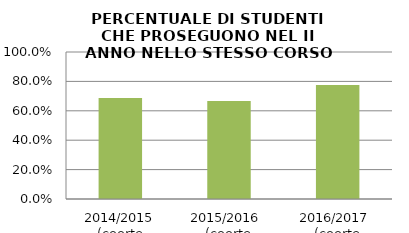
| Category | 2014/2015 (coorte 2013/14) 2015/2016  (coorte 2014/15) 2016/2017  (coorte 2015/16) |
|---|---|
| 2014/2015 (coorte 2013/14) | 0.688 |
| 2015/2016  (coorte 2014/15) | 0.667 |
| 2016/2017  (coorte 2015/16) | 0.775 |